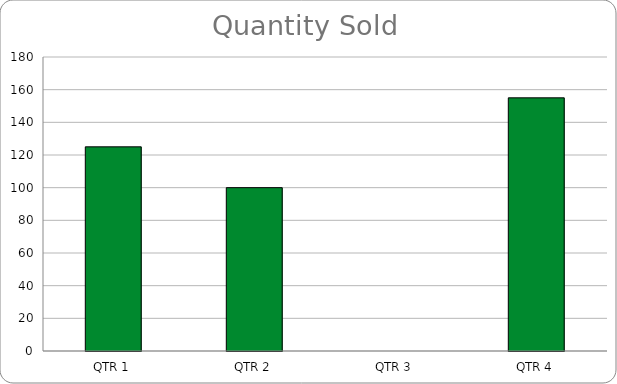
| Category | Quantity Sales |
|---|---|
| QTR 1 | 125 |
| QTR 2 | 100 |
| QTR 3 | 0 |
| QTR 4 | 155 |